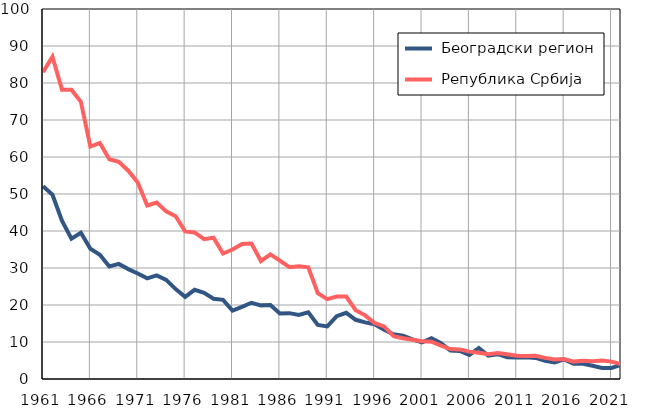
| Category |  Београдски регион |  Република Србија |
|---|---|---|
| 1961.0 | 52.1 | 82.9 |
| 1962.0 | 49.8 | 87.1 |
| 1963.0 | 42.8 | 78.2 |
| 1964.0 | 37.9 | 78.2 |
| 1965.0 | 39.5 | 74.9 |
| 1966.0 | 35.2 | 62.8 |
| 1967.0 | 33.6 | 63.8 |
| 1968.0 | 30.4 | 59.4 |
| 1969.0 | 31.1 | 58.7 |
| 1970.0 | 29.7 | 56.3 |
| 1971.0 | 28.5 | 53.1 |
| 1972.0 | 27.2 | 46.9 |
| 1973.0 | 28 | 47.7 |
| 1974.0 | 26.8 | 45.3 |
| 1975.0 | 24.3 | 44 |
| 1976.0 | 22.2 | 39.9 |
| 1977.0 | 24.1 | 39.6 |
| 1978.0 | 23.3 | 37.8 |
| 1979.0 | 21.7 | 38.2 |
| 1980.0 | 21.4 | 33.9 |
| 1981.0 | 18.5 | 35 |
| 1982.0 | 19.5 | 36.5 |
| 1983.0 | 20.6 | 36.6 |
| 1984.0 | 19.9 | 31.9 |
| 1985.0 | 20 | 33.7 |
| 1986.0 | 17.7 | 32 |
| 1987.0 | 17.8 | 30.2 |
| 1988.0 | 17.3 | 30.5 |
| 1989.0 | 18 | 30.2 |
| 1990.0 | 14.6 | 23.2 |
| 1991.0 | 14.2 | 21.6 |
| 1992.0 | 17 | 22.3 |
| 1993.0 | 17.9 | 22.3 |
| 1994.0 | 16 | 18.6 |
| 1995.0 | 15.3 | 17.2 |
| 1996.0 | 14.8 | 15.1 |
| 1997.0 | 13.3 | 14.2 |
| 1998.0 | 12.1 | 11.6 |
| 1999.0 | 11.7 | 11 |
| 2000.0 | 10.7 | 10.6 |
| 2001.0 | 9.9 | 10.2 |
| 2002.0 | 11 | 10.1 |
| 2003.0 | 9.7 | 9 |
| 2004.0 | 7.7 | 8.1 |
| 2005.0 | 7.6 | 8 |
| 2006.0 | 6.5 | 7.4 |
| 2007.0 | 8.4 | 7.1 |
| 2008.0 | 6.3 | 6.7 |
| 2009.0 | 6.7 | 7 |
| 2010.0 | 5.9 | 6.7 |
| 2011.0 | 5.8 | 6.3 |
| 2012.0 | 5.9 | 6.2 |
| 2013.0 | 5.7 | 6.3 |
| 2014.0 | 4.9 | 5.7 |
| 2015.0 | 4.5 | 5.3 |
| 2016.0 | 5.3 | 5.4 |
| 2017.0 | 4.1 | 4.7 |
| 2018.0 | 4.1 | 4.9 |
| 2019.0 | 3.6 | 4.8 |
| 2020.0 | 3 | 5 |
| 2021.0 | 3 | 4.7 |
| 2022.0 | 3.8 | 4 |